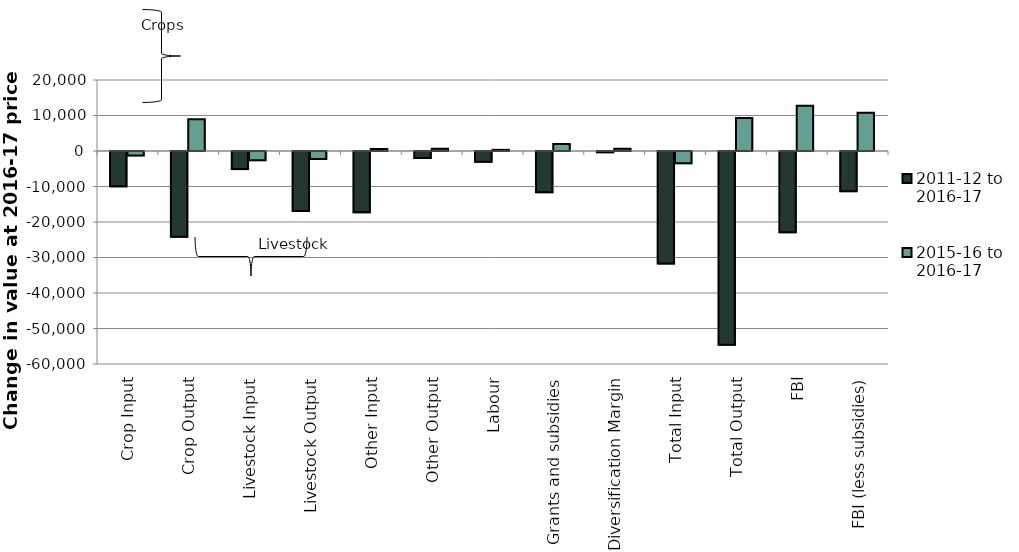
| Category | 2011-12 to 2016-17 | 2015-16 to 2016-17 |
|---|---|---|
| Crop Input | -9963.85 | -1233.546 |
| Crop Output | -24147.811 | 8918.714 |
| Livestock Input | -5101.814 | -2582.447 |
| Livestock Output | -16898.32 | -2260.447 |
| Other Input | -17221.155 | 572.717 |
| Other Output | -1956.684 | 604.755 |
| Labour | -3018.044 | 319.413 |
| Grants and subsidies | -11592.712 | 1969.779 |
| Diversification Margin | -346.549 | 612.483 |
| Total Input | -31700.462 | -3454.861 |
| Total Output | -54598.837 | 9314.187 |
| FBI | -22898.375 | 12769.048 |
| FBI (less subsidies) | -11305.663 | 10799.269 |